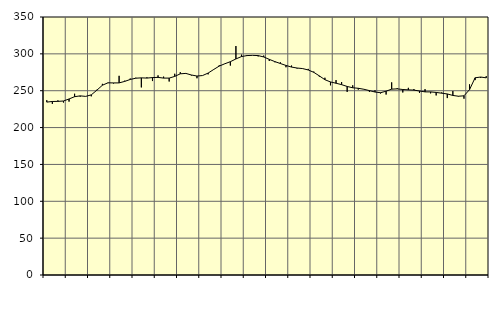
| Category | Piggar | Series 1 |
|---|---|---|
| nan | 237.1 | 234.55 |
| 1.0 | 232.1 | 235.41 |
| 1.0 | 236.9 | 235.52 |
| 1.0 | 234 | 236.06 |
| nan | 235.2 | 238.79 |
| 2.0 | 245.9 | 241.88 |
| 2.0 | 241.9 | 243.02 |
| 2.0 | 242.4 | 242.3 |
| nan | 242.4 | 244.39 |
| 3.0 | 251.3 | 250.71 |
| 3.0 | 259.3 | 257.44 |
| 3.0 | 260.4 | 260.72 |
| nan | 259.8 | 260.57 |
| 4.0 | 270.2 | 260.61 |
| 4.0 | 263.6 | 262.61 |
| 4.0 | 266.5 | 265.25 |
| nan | 267.6 | 266.98 |
| 5.0 | 254.5 | 267.43 |
| 5.0 | 268.2 | 267.13 |
| 5.0 | 263.1 | 267.84 |
| nan | 270.8 | 268.09 |
| 6.0 | 269.1 | 267.1 |
| 6.0 | 262.5 | 267.12 |
| 6.0 | 273 | 269.4 |
| nan | 275.1 | 272.92 |
| 7.0 | 273.9 | 273.46 |
| 7.0 | 270.7 | 271.33 |
| 7.0 | 266.9 | 269.91 |
| nan | 270.5 | 270.57 |
| 8.0 | 272.2 | 273.92 |
| 8.0 | 279.1 | 278.76 |
| 8.0 | 284.5 | 283.38 |
| nan | 286.7 | 286.55 |
| 9.0 | 284.1 | 289.36 |
| 9.0 | 310.6 | 293.1 |
| 9.0 | 298.9 | 296.32 |
| nan | 297.1 | 297.68 |
| 10.0 | 297.9 | 297.97 |
| 10.0 | 296.5 | 297.66 |
| 10.0 | 297.7 | 295.8 |
| nan | 290.3 | 292.52 |
| 11.0 | 288.6 | 289.5 |
| 11.0 | 288.5 | 286.86 |
| 11.0 | 281.8 | 284.29 |
| nan | 284.1 | 282.08 |
| 12.0 | 280.1 | 280.76 |
| 12.0 | 280.2 | 280.02 |
| 12.0 | 279.6 | 278.14 |
| nan | 275.9 | 274.94 |
| 13.0 | 269.1 | 270.1 |
| 13.0 | 267.6 | 264.93 |
| 13.0 | 257.3 | 261.9 |
| nan | 264.4 | 260.15 |
| 14.0 | 261.8 | 258.23 |
| 14.0 | 248.4 | 255.76 |
| 14.0 | 257.3 | 253.99 |
| nan | 251.5 | 253.28 |
| 15.0 | 252.1 | 251.97 |
| 15.0 | 248.3 | 250.16 |
| 15.0 | 250.5 | 248.23 |
| nan | 246.3 | 247.28 |
| 16.0 | 244.8 | 249.36 |
| 16.0 | 261.3 | 252.12 |
| 16.0 | 253.5 | 252.52 |
| nan | 247.6 | 251.63 |
| 17.0 | 253.9 | 251.16 |
| 17.0 | 252.2 | 250.79 |
| 17.0 | 247.1 | 249.62 |
| nan | 252.1 | 248.44 |
| 18.0 | 246.4 | 248.37 |
| 18.0 | 243.6 | 247.68 |
| 18.0 | 247.7 | 246.63 |
| nan | 240 | 245.61 |
| 19.0 | 249.5 | 243.58 |
| 19.0 | 242.1 | 242.53 |
| 19.0 | 239.2 | 243.07 |
| nan | 258.6 | 251.46 |
| 20.0 | 264.4 | 267.54 |
| 20.0 | 267.4 | 268.56 |
| 20.0 | 269.7 | 267.47 |